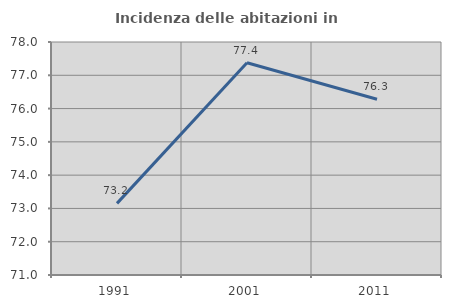
| Category | Incidenza delle abitazioni in proprietà  |
|---|---|
| 1991.0 | 73.151 |
| 2001.0 | 77.378 |
| 2011.0 | 76.279 |